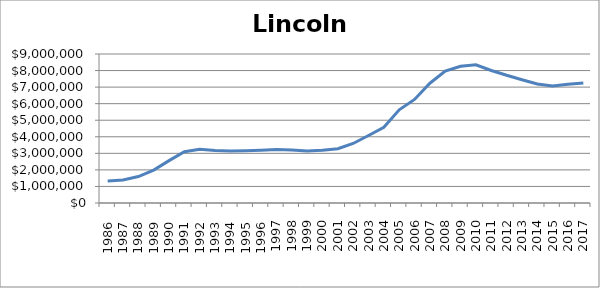
| Category | Lincoln (000s) |
|---|---|
|       1986 | 1323000 |
|       1987 | 1385200 |
|       1988 | 1599600 |
|       1989 | 1990100 |
|       1990 | 2559100 |
|       1991 | 3101900 |
|       1992 | 3250500 |
|       1993 | 3178200 |
|       1994 | 3147650 |
|       1995 | 3161050 |
|       1996 | 3185350 |
| 1997 | 3224600 |
| 1998 | 3195400 |
| 1999 | 3134850 |
| 2000 | 3180350 |
| 2001 | 3276350 |
| 2002 | 3596150 |
| 2003 | 4076650 |
| 2004 | 4574150 |
| 2005 | 5626700 |
| 2006 | 6256900 |
| 2007 | 7235600 |
| 2008 | 7967850 |
| 2009 | 8257550 |
| 2010 | 8345000 |
| 2011 | 8003050 |
| 2012 | 7713300 |
| 2013 | 7447950 |
| 2014 | 7183900 |
| 2015 | 7075000 |
| 2016 | 7178350 |
| 2017 | 7241900 |